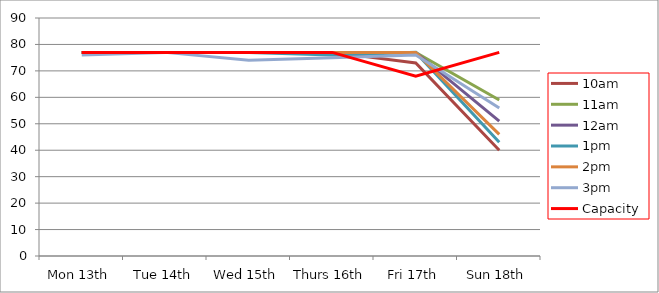
| Category | 9am | 10am | 11am | 12am | 1pm | 2pm | 3pm | 4pm | 5pm | Capacity |
|---|---|---|---|---|---|---|---|---|---|---|
| Mon 13th |  | 77 | 77 | 77 | 77 | 77 | 76 |  |  | 77 |
| Tue 14th |  | 77 | 77 | 77 | 77 | 77 | 77 |  |  | 77 |
| Wed 15th |  | 77 | 77 | 77 | 77 | 77 | 74 |  |  | 77 |
| Thurs 16th |  | 77 | 77 | 77 | 76 | 77 | 75 |  |  | 77 |
| Fri 17th |  | 73 | 77 | 77 | 77 | 77 | 76 |  |  | 68 |
| Sun 18th |  | 40 | 59 | 51 | 43 | 46 | 56 |  |  | 77 |